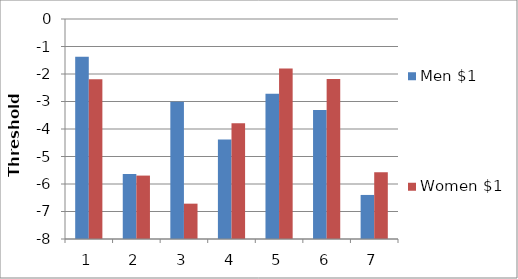
| Category | Men $1 | Women $1 |
|---|---|---|
| 0 | -1.372 | -2.188 |
| 1 | -5.632 | -5.694 |
| 2 | -3.005 | -6.715 |
| 3 | -4.378 | -3.791 |
| 4 | -2.722 | -1.798 |
| 5 | -3.311 | -2.184 |
| 6 | -6.398 | -5.577 |